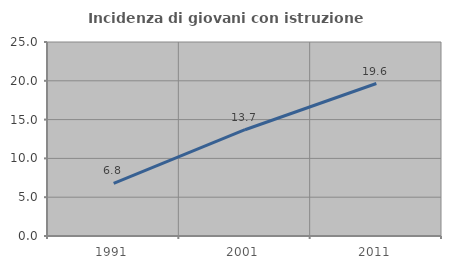
| Category | Incidenza di giovani con istruzione universitaria |
|---|---|
| 1991.0 | 6.78 |
| 2001.0 | 13.695 |
| 2011.0 | 19.65 |